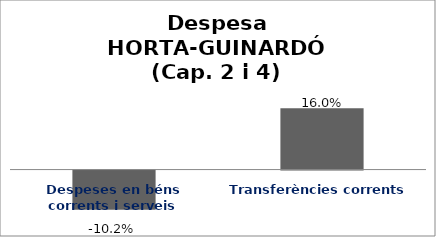
| Category | Series 0 |
|---|---|
| Despeses en béns corrents i serveis | -0.102 |
| Transferències corrents | 0.16 |